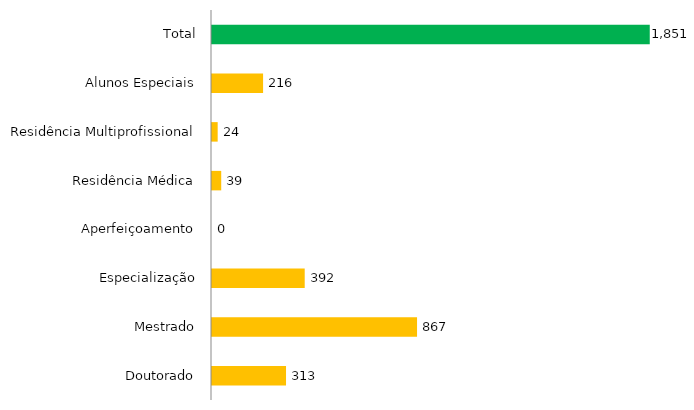
| Category | Pós - Gradução UFGD |
|---|---|
| Doutorado | 313 |
| Mestrado | 867 |
| Especialização | 392 |
| Aperfeiçoamento | 0 |
| Residência Médica | 39 |
| Residência Multiprofissional | 24 |
| Alunos Especiais | 216 |
| Total | 1851 |